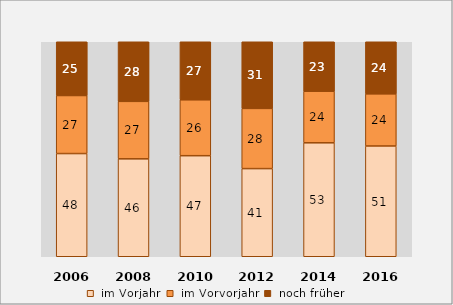
| Category |  im Vorjahr |  im Vorvorjahr |  noch früher |
|---|---|---|---|
| 2006.0 | 48 | 27 | 25 |
| 2008.0 | 46 | 27 | 28 |
| 2010.0 | 47 | 26 | 27 |
| 2012.0 | 41 | 28 | 31 |
| 2014.0 | 53 | 24 | 23 |
| 2016.0 | 51 | 24 | 24 |